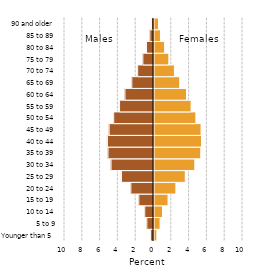
| Category | Series 0 |
|---|---|
| Younger than 5 | 0.32 |
| 5 to 9 | 0.683 |
| 10 to 14 | 0.957 |
| 15 to 19 | 1.578 |
| 20 to 24 | 2.46 |
| 25 to 29 | 3.514 |
| 30 to 34 | 4.585 |
| 35 to 39 | 5.25 |
| 40 to 44 | 5.336 |
| 45 to 49 | 5.286 |
| 50 to 54 | 4.709 |
| 55 to 59 | 4.168 |
| 60 to 64 | 3.65 |
| 65 to 69 | 2.891 |
| 70 to 74 | 2.294 |
| 75 to 79 | 1.669 |
| 80 to 84 | 1.192 |
| 85 to 89 | 0.725 |
| 90 and older | 0.503 |